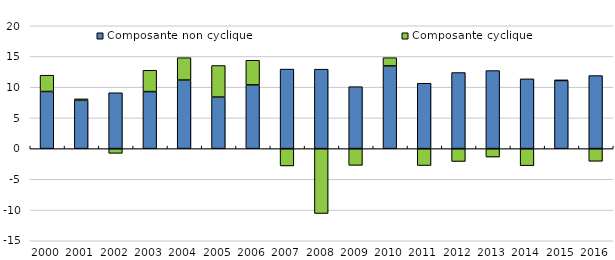
| Category | Composante non cyclique | Composante cyclique |
|---|---|---|
| 2000.0 | 9.295 | 2.655 |
| 2001.0 | 7.864 | 0.236 |
| 2002.0 | 9.094 | -0.764 |
| 2003.0 | 9.281 | 3.469 |
| 2004.0 | 11.161 | 3.639 |
| 2005.0 | 8.387 | 5.143 |
| 2006.0 | 10.376 | 4.004 |
| 2007.0 | 12.948 | -2.818 |
| 2008.0 | 12.932 | -10.562 |
| 2009.0 | 10.083 | -2.723 |
| 2010.0 | 13.465 | 1.335 |
| 2011.0 | 10.642 | -2.752 |
| 2012.0 | 12.385 | -2.095 |
| 2013.0 | 12.705 | -1.375 |
| 2014.0 | 11.358 | -2.778 |
| 2015.0 | 11.091 | 0.069 |
| 2016.0 | 11.888 | -2.058 |